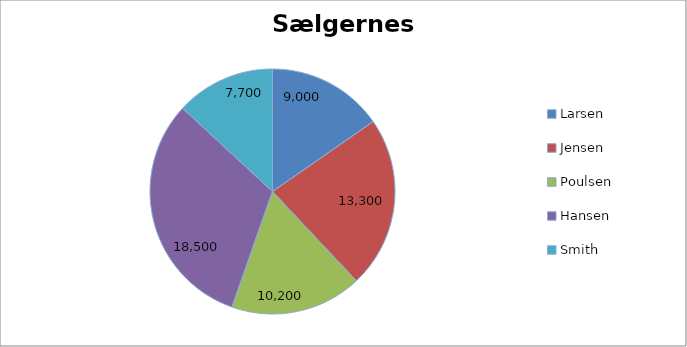
| Category | Series 0 |
|---|---|
| Larsen | 9000 |
| Jensen | 13300 |
| Poulsen | 10200 |
| Hansen | 18500 |
| Smith | 7700 |